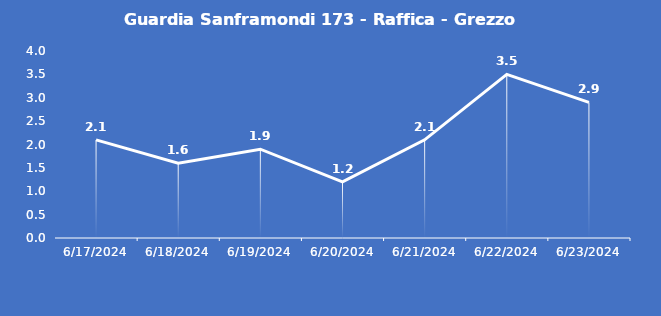
| Category | Guardia Sanframondi 173 - Raffica - Grezzo (m/s) |
|---|---|
| 6/17/24 | 2.1 |
| 6/18/24 | 1.6 |
| 6/19/24 | 1.9 |
| 6/20/24 | 1.2 |
| 6/21/24 | 2.1 |
| 6/22/24 | 3.5 |
| 6/23/24 | 2.9 |